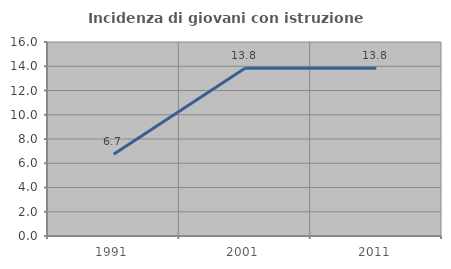
| Category | Incidenza di giovani con istruzione universitaria |
|---|---|
| 1991.0 | 6.748 |
| 2001.0 | 13.842 |
| 2011.0 | 13.826 |